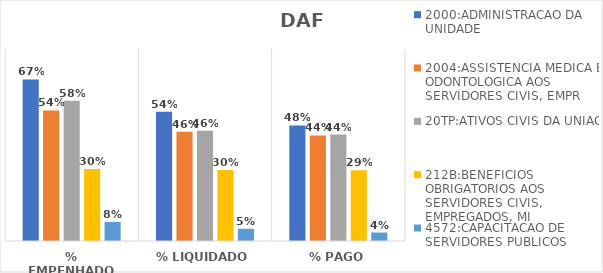
| Category | 2000:ADMINISTRACAO DA UNIDADE | 2004:ASSISTENCIA MEDICA E ODONTOLOGICA AOS SERVIDORES CIVIS, EMPR | 20TP:ATIVOS CIVIS DA UNIAO | 212B:BENEFICIOS OBRIGATORIOS AOS SERVIDORES CIVIS, EMPREGADOS, MI | 4572:CAPACITACAO DE SERVIDORES PUBLICOS FEDERAIS EM PROCESSO DE Q |
|---|---|---|---|---|---|
| % EMPENHADO | 0.673 | 0.544 | 0.584 | 0.3 | 0.08 |
| % LIQUIDADO | 0.538 | 0.456 | 0.459 | 0.296 | 0.051 |
| % PAGO | 0.481 | 0.44 | 0.444 | 0.295 | 0.035 |